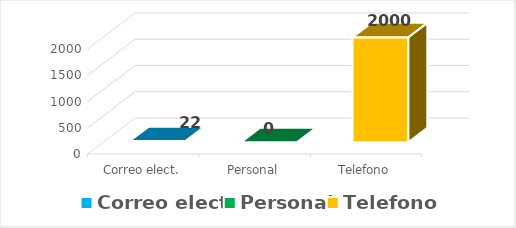
| Category | Series 0 |
|---|---|
| Correo elect. | 22 |
| Personal | 0 |
| Telefono | 2000 |